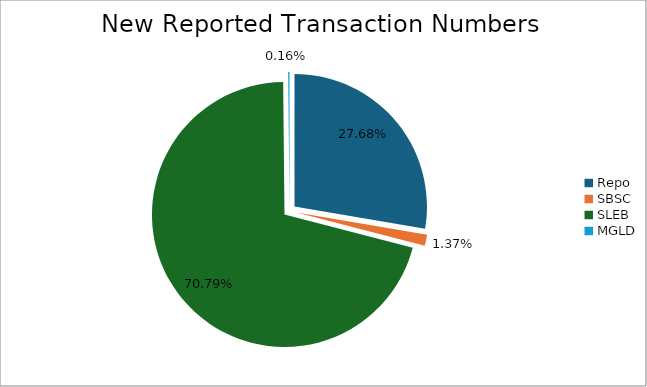
| Category | Series 0 |
|---|---|
| Repo | 391604 |
| SBSC | 19318 |
| SLEB | 1001372 |
| MGLD | 2266 |